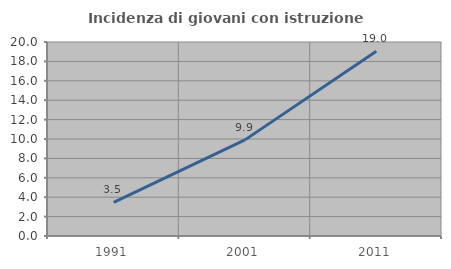
| Category | Incidenza di giovani con istruzione universitaria |
|---|---|
| 1991.0 | 3.472 |
| 2001.0 | 9.91 |
| 2011.0 | 19.048 |